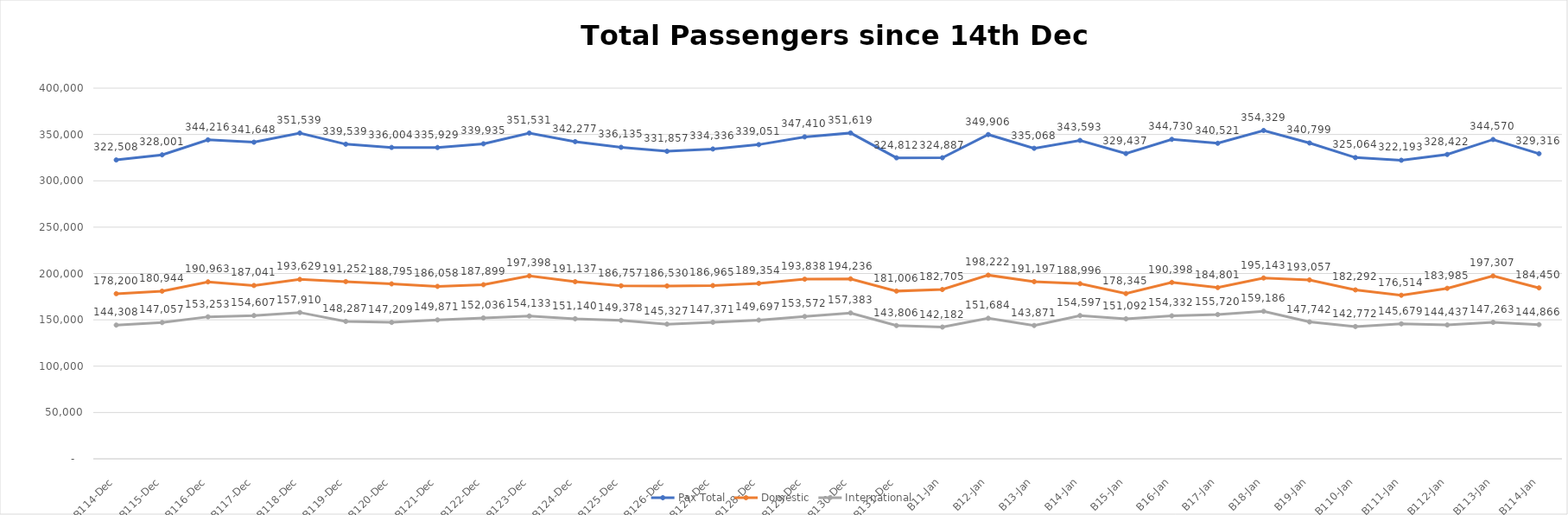
| Category | Pax Total |  Domestic  |  International  |
|---|---|---|---|
| 2022-12-14 | 322508 | 178200 | 144308 |
| 2022-12-15 | 328001 | 180944 | 147057 |
| 2022-12-16 | 344216 | 190963 | 153253 |
| 2022-12-17 | 341648 | 187041 | 154607 |
| 2022-12-18 | 351539 | 193629 | 157910 |
| 2022-12-19 | 339539 | 191252 | 148287 |
| 2022-12-20 | 336004 | 188795 | 147209 |
| 2022-12-21 | 335929 | 186058 | 149871 |
| 2022-12-22 | 339935 | 187899 | 152036 |
| 2022-12-23 | 351531 | 197398 | 154133 |
| 2022-12-24 | 342277 | 191137 | 151140 |
| 2022-12-25 | 336135 | 186757 | 149378 |
| 2022-12-26 | 331857 | 186530 | 145327 |
| 2022-12-27 | 334336 | 186965 | 147371 |
| 2022-12-28 | 339051 | 189354 | 149697 |
| 2022-12-29 | 347410 | 193838 | 153572 |
| 2022-12-30 | 351619 | 194236 | 157383 |
| 2022-12-31 | 324812 | 181006 | 143806 |
| 2023-01-01 | 324887 | 182705 | 142182 |
| 2023-01-02 | 349906 | 198222 | 151684 |
| 2023-01-03 | 335068 | 191197 | 143871 |
| 2023-01-04 | 343593 | 188996 | 154597 |
| 2023-01-05 | 329437 | 178345 | 151092 |
| 2023-01-06 | 344730 | 190398 | 154332 |
| 2023-01-07 | 340521 | 184801 | 155720 |
| 2023-01-08 | 354329 | 195143 | 159186 |
| 2023-01-09 | 340799 | 193057 | 147742 |
| 2023-01-10 | 325064 | 182292 | 142772 |
| 2023-01-11 | 322193 | 176514 | 145679 |
| 2023-01-12 | 328422 | 183985 | 144437 |
| 2023-01-13 | 344570 | 197307 | 147263 |
| 2023-01-14 | 329316 | 184450 | 144866 |